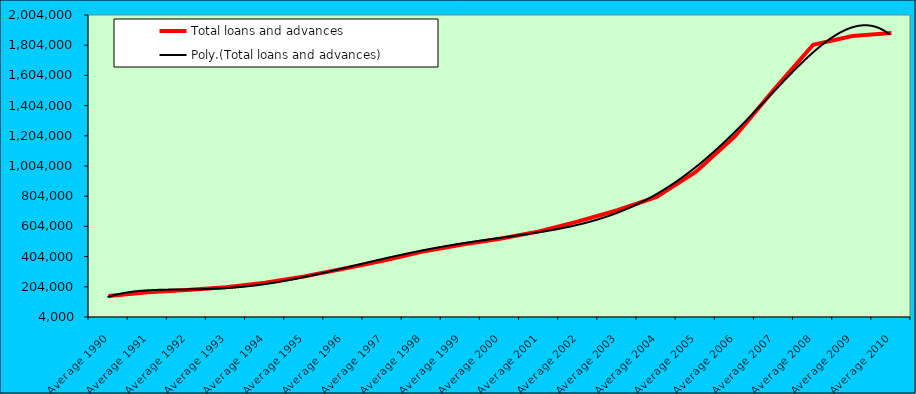
| Category | Total loans and advances |
|---|---|
| Average 1990 | 142836.917 |
| Average 1991 | 167269 |
| Average 1992 | 183192.667 |
| Average 1993 | 201169.417 |
| Average 1994 | 230859.25 |
| Average 1995 | 272838.333 |
| Average 1996 | 323967.417 |
| Average 1997 | 376592 |
| Average 1998 | 435516.5 |
| Average 1999 | 482961 |
| Average 2000 | 522371.583 |
| Average 2001 | 571103.818 |
| Average 2002 | 637028.083 |
| Average 2003 | 710867.083 |
| Average 2004 | 798733.25 |
| Average 2005 | 964176.667 |
| Average 2006 | 1201030.917 |
| Average 2007 | 1509941.167 |
| Average 2008 | 1807369.5 |
| Average 2009 | 1864968.583 |
| Average 2010 | 1884305.25 |